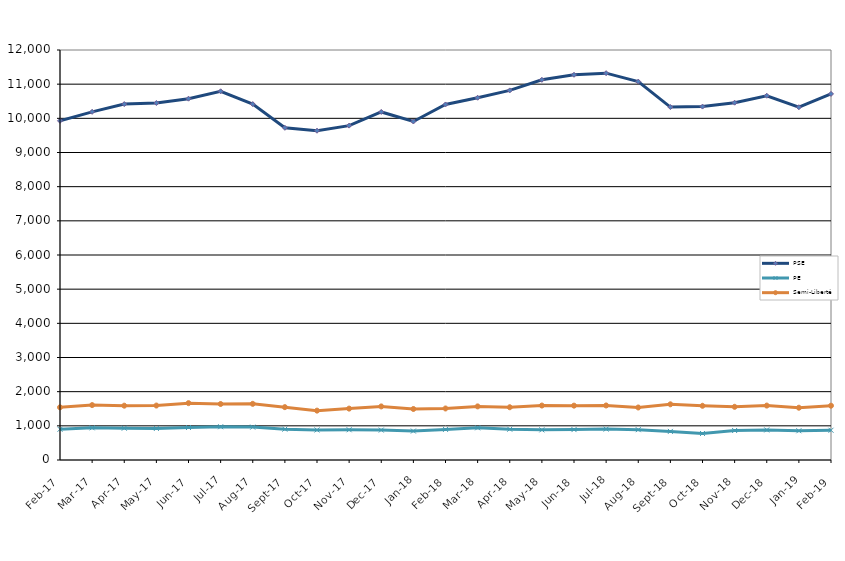
| Category | PSE | PE | Semi-Liberté |
|---|---|---|---|
| 2017-02-01 | 9927 | 900 | 1542 |
| 2017-03-01 | 10190 | 942 | 1607 |
| 2017-04-01 | 10417 | 931 | 1590 |
| 2017-05-01 | 10448 | 924 | 1594 |
| 2017-06-01 | 10575 | 951 | 1664 |
| 2017-07-01 | 10791 | 974 | 1639 |
| 2017-08-01 | 10417 | 963 | 1644 |
| 2017-09-01 | 9723 | 903 | 1547 |
| 2017-10-01 | 9637 | 879 | 1445 |
| 2017-11-01 | 9787 | 885 | 1504 |
| 2017-12-01 | 10187 | 876 | 1568 |
| 2018-01-01 | 9907 | 847 | 1493 |
| 2018-02-01 | 10406 | 895 | 1508 |
| 2018-03-01 | 10603 | 942 | 1569 |
| 2018-04-01 | 10817 | 901 | 1544 |
| 2018-05-01 | 11127 | 882 | 1594 |
| 2018-06-01 | 11275 | 890 | 1591 |
| 2018-07-01 | 11322 | 905 | 1596 |
| 2018-08-01 | 11075 | 888 | 1537 |
| 2018-09-01 | 10329 | 837 | 1630 |
| 2018-10-01 | 10344 | 776 | 1587 |
| 2018-11-01 | 10458 | 863 | 1557 |
| 2018-12-01 | 10661 | 880 | 1593 |
| 2019-01-01 | 10325 | 856 | 1530 |
| 2019-02-01 | 10715 | 871 | 1589 |